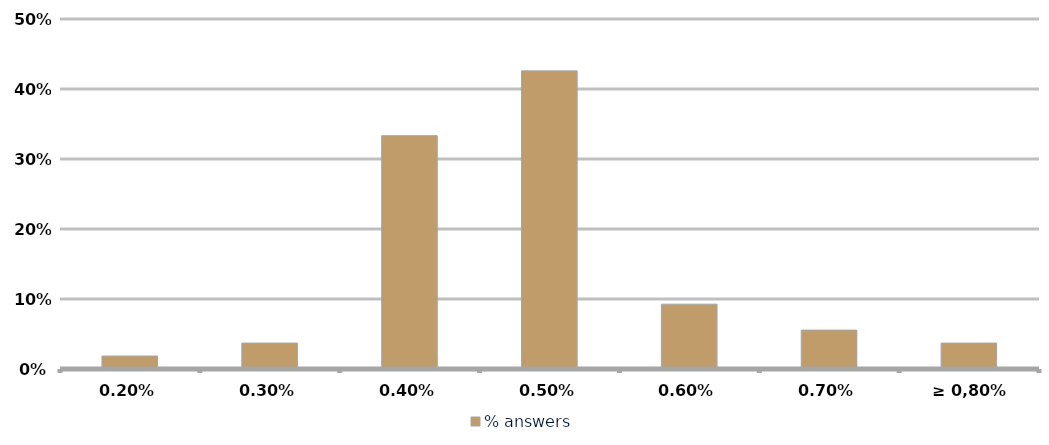
| Category | % answers |
|---|---|
| 0,20% | 0.019 |
| 0,30% | 0.037 |
| 0,40% | 0.333 |
| 0,50% | 0.426 |
| 0,60% | 0.093 |
| 0,70% | 0.056 |
| ≥ 0,80% | 0.037 |